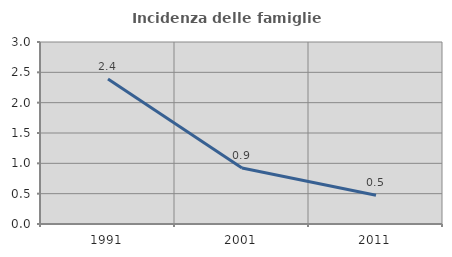
| Category | Incidenza delle famiglie numerose |
|---|---|
| 1991.0 | 2.389 |
| 2001.0 | 0.922 |
| 2011.0 | 0.475 |